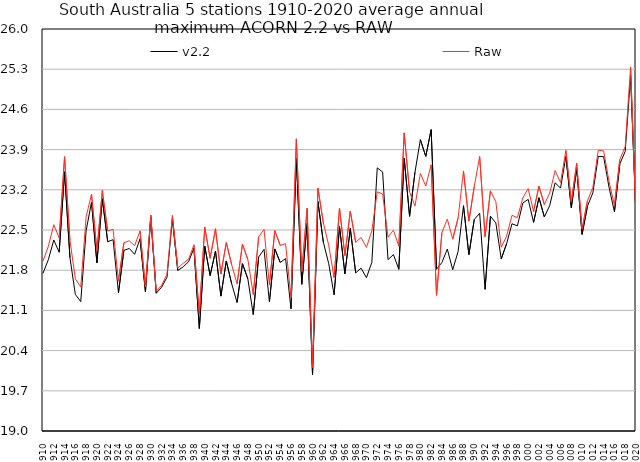
| Category | v2.2 | Raw |
|---|---|---|
| 1910 | 21.747 | 21.96 |
| 1911 | 21.986 | 22.219 |
| 1912 | 22.326 | 22.592 |
| 1913 | 22.113 | 22.363 |
| 1914 | 23.514 | 23.776 |
| 1915 | 22.018 | 22.32 |
| 1916 | 21.378 | 21.65 |
| 1917 | 21.253 | 21.508 |
| 1918 | 22.488 | 22.732 |
| 1919 | 22.986 | 23.125 |
| 1920 | 21.927 | 22.144 |
| 1921 | 23.045 | 23.187 |
| 1922 | 22.296 | 22.481 |
| 1923 | 22.331 | 22.513 |
| 1924 | 21.407 | 21.615 |
| 1925 | 22.145 | 22.278 |
| 1926 | 22.178 | 22.313 |
| 1927 | 22.078 | 22.227 |
| 1928 | 22.347 | 22.485 |
| 1929 | 21.425 | 21.509 |
| 1930 | 22.727 | 22.76 |
| 1931 | 21.399 | 21.435 |
| 1932 | 21.504 | 21.535 |
| 1933 | 21.677 | 21.732 |
| 1934 | 22.697 | 22.753 |
| 1935 | 21.796 | 21.837 |
| 1936 | 21.858 | 21.921 |
| 1937 | 21.947 | 21.99 |
| 1938 | 22.184 | 22.242 |
| 1939 | 20.785 | 21.038 |
| 1940 | 22.221 | 22.551 |
| 1941 | 21.706 | 22.008 |
| 1942 | 22.134 | 22.521 |
| 1943 | 21.348 | 21.736 |
| 1944 | 21.961 | 22.281 |
| 1945 | 21.563 | 21.894 |
| 1946 | 21.238 | 21.563 |
| 1947 | 21.914 | 22.253 |
| 1948 | 21.648 | 21.985 |
| 1949 | 21.027 | 21.376 |
| 1950 | 22.028 | 22.378 |
| 1951 | 22.164 | 22.512 |
| 1952 | 21.249 | 21.544 |
| 1953 | 22.171 | 22.49 |
| 1954 | 21.935 | 22.233 |
| 1955 | 22.002 | 22.261 |
| 1956 | 21.128 | 21.322 |
| 1957 | 23.746 | 24.087 |
| 1958 | 21.555 | 21.781 |
| 1959 | 22.619 | 22.878 |
| 1960 | 19.977 | 20.109 |
| 1961 | 22.995 | 23.231 |
| 1962 | 22.29 | 22.624 |
| 1963 | 21.914 | 22.236 |
| 1964 | 21.373 | 21.67 |
| 1965 | 22.559 | 22.88 |
| 1966 | 21.737 | 22.056 |
| 1967 | 22.527 | 22.83 |
| 1968 | 21.753 | 22.284 |
| 1969 | 21.836 | 22.369 |
| 1970 | 21.669 | 22.197 |
| 1971 | 21.938 | 22.486 |
| 1972 | 23.582 | 23.164 |
| 1973 | 23.51 | 23.127 |
| 1974 | 21.983 | 22.377 |
| 1975 | 22.073 | 22.496 |
| 1976 | 21.815 | 22.221 |
| 1977 | 23.754 | 24.19 |
| 1978 | 22.738 | 23.162 |
| 1979 | 23.507 | 22.916 |
| 1980 | 24.073 | 23.485 |
| 1981 | 23.782 | 23.265 |
| 1982 | 24.248 | 23.636 |
| 1983 | 21.817 | 21.363 |
| 1984 | 21.935 | 22.456 |
| 1985 | 22.168 | 22.69 |
| 1986 | 21.809 | 22.341 |
| 1987 | 22.126 | 22.711 |
| 1988 | 22.923 | 23.528 |
| 1989 | 22.07 | 22.656 |
| 1990 | 22.684 | 23.26 |
| 1991 | 22.792 | 23.779 |
| 1992 | 21.467 | 22.383 |
| 1993 | 22.739 | 23.182 |
| 1994 | 22.624 | 22.992 |
| 1995 | 21.998 | 22.199 |
| 1996 | 22.262 | 22.394 |
| 1997 | 22.608 | 22.756 |
| 1998 | 22.572 | 22.715 |
| 1999 | 22.969 | 23.057 |
| 2000 | 23.034 | 23.22 |
| 2001 | 22.633 | 22.823 |
| 2002 | 23.062 | 23.263 |
| 2003 | 22.727 | 22.944 |
| 2004 | 22.927 | 23.145 |
| 2005 | 23.323 | 23.534 |
| 2006 | 23.229 | 23.328 |
| 2007 | 23.782 | 23.886 |
| 2008 | 22.886 | 22.988 |
| 2009 | 23.572 | 23.662 |
| 2010 | 22.423 | 22.518 |
| 2011 | 22.917 | 23.012 |
| 2012 | 23.147 | 23.242 |
| 2013 | 23.782 | 23.889 |
| 2014 | 23.776 | 23.877 |
| 2015 | 23.244 | 23.345 |
| 2016 | 22.816 | 22.93 |
| 2017 | 23.651 | 23.728 |
| 2018 | 23.869 | 23.952 |
| 2019 | 25.19 | 25.34 |
| 2020 | 22.729 | 22.725 |